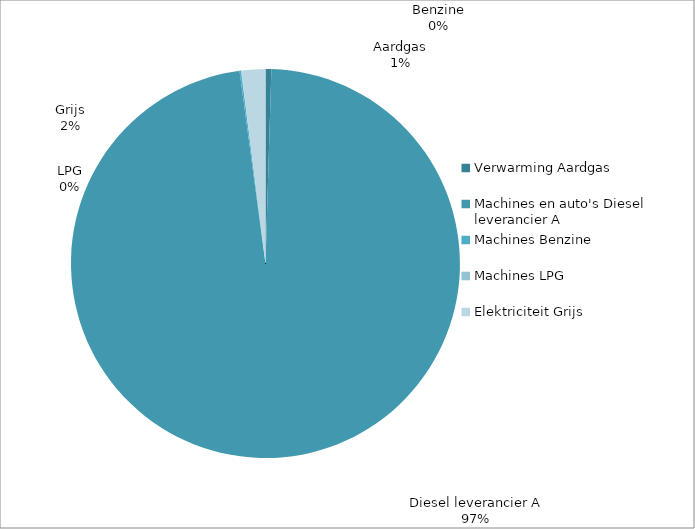
| Category | Series 0 |
|---|---|
| 0 | 3.355 |
| 1 | 676.272 |
| 2 | 0.904 |
| 3 | 0.108 |
| 4 | 13.813 |